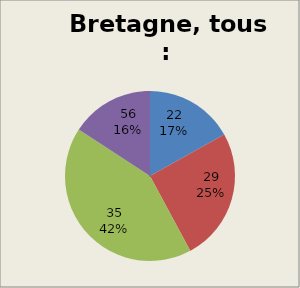
| Category | Tous |
|---|---|
| 22.0 | 170 |
| 29.0 | 254 |
| 35.0 | 423 |
| 56.0 | 159 |